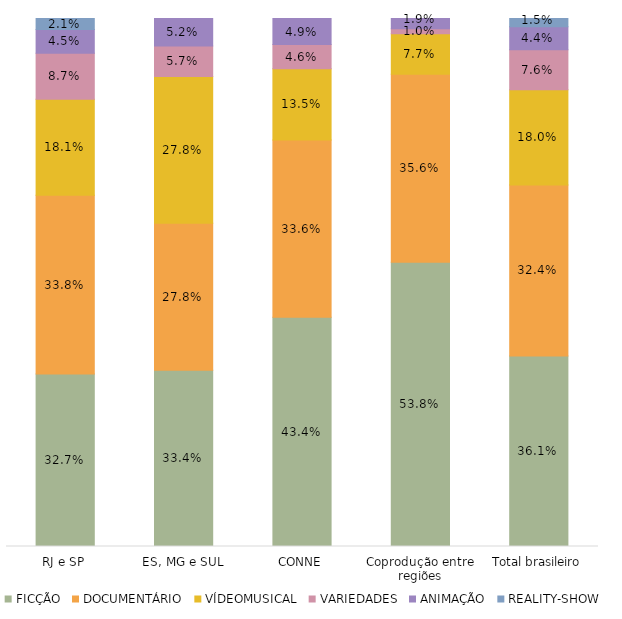
| Category | FICÇÃO | DOCUMENTÁRIO | VÍDEOMUSICAL | VARIEDADES | ANIMAÇÃO | REALITY-SHOW |
|---|---|---|---|---|---|---|
| RJ e SP | 0.327 | 0.338 | 0.181 | 0.087 | 0.045 | 0.021 |
| ES, MG e SUL | 0.334 | 0.278 | 0.278 | 0.057 | 0.052 | 0 |
| CONNE | 0.434 | 0.336 | 0.135 | 0.046 | 0.049 | 0 |
| Coprodução entre regiões | 0.538 | 0.356 | 0.077 | 0.01 | 0.019 | 0 |
| Total brasileiro | 0.361 | 0.324 | 0.18 | 0.076 | 0.044 | 0.015 |